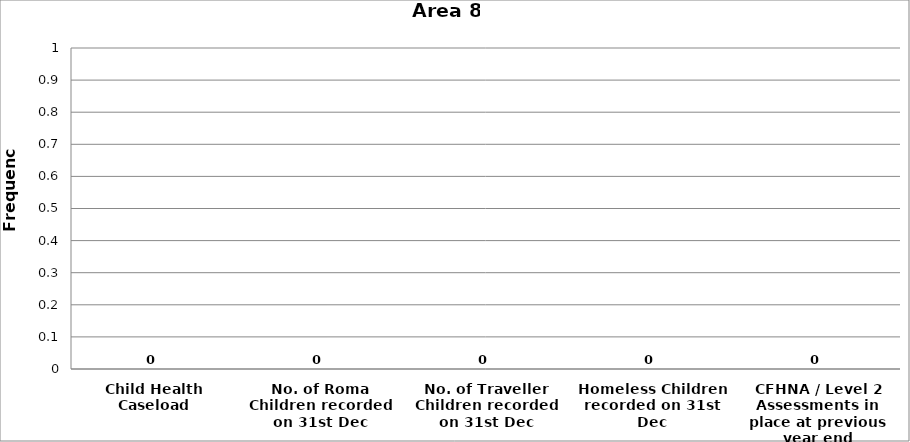
| Category | Area 8 |
|---|---|
| Child Health Caseload | 0 |
| No. of Roma Children recorded on 31st Dec | 0 |
| No. of Traveller Children recorded on 31st Dec | 0 |
| Homeless Children recorded on 31st Dec | 0 |
| CFHNA / Level 2 Assessments in place at previous year end | 0 |